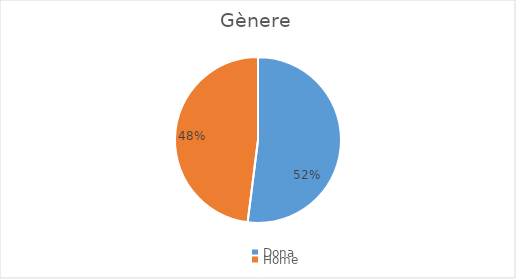
| Category | Series 0 |
|---|---|
| Dona | 39 |
| Home | 36 |